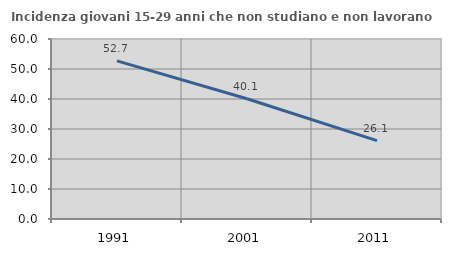
| Category | Incidenza giovani 15-29 anni che non studiano e non lavorano  |
|---|---|
| 1991.0 | 52.725 |
| 2001.0 | 40.079 |
| 2011.0 | 26.111 |